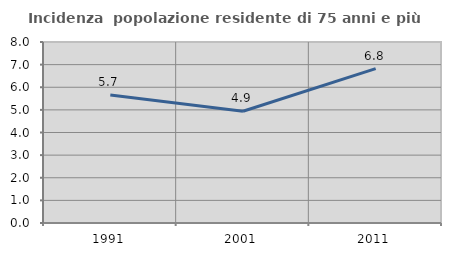
| Category | Incidenza  popolazione residente di 75 anni e più |
|---|---|
| 1991.0 | 5.659 |
| 2001.0 | 4.939 |
| 2011.0 | 6.823 |